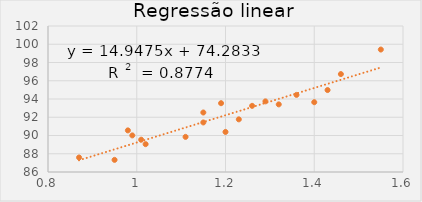
| Category | Series 1 |
|---|---|
| 0.99 | 90.01 |
| 1.02 | 89.05 |
| 1.15 | 91.43 |
| 1.29 | 93.74 |
| 1.46 | 96.73 |
| 1.36 | 94.45 |
| 0.87 | 87.59 |
| 1.23 | 91.77 |
| 1.55 | 99.42 |
| 1.4 | 93.65 |
| 1.19 | 93.54 |
| 1.15 | 92.52 |
| 0.98 | 90.56 |
| 1.01 | 89.54 |
| 1.11 | 89.85 |
| 1.2 | 90.39 |
| 1.26 | 93.25 |
| 1.32 | 93.41 |
| 1.43 | 94.98 |
| 0.95 | 87.33 |